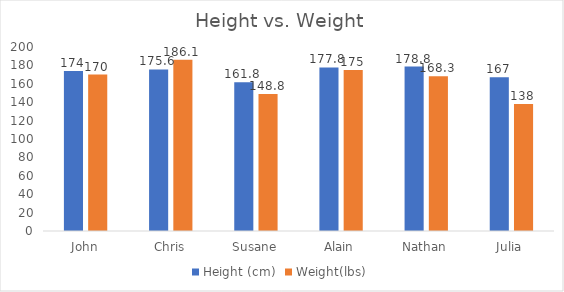
| Category | Height (cm) | Weight(lbs) |
|---|---|---|
| John | 174 | 170 |
| Chris | 175.6 | 186.1 |
| Susane | 161.8 | 148.8 |
| Alain | 177.8 | 175 |
| Nathan | 178.8 | 168.3 |
| Julia | 167 | 138 |